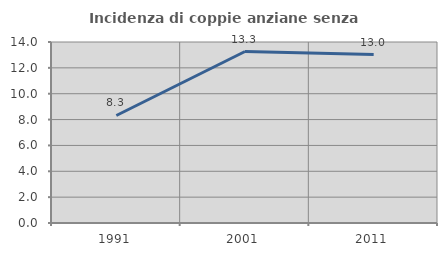
| Category | Incidenza di coppie anziane senza figli  |
|---|---|
| 1991.0 | 8.315 |
| 2001.0 | 13.263 |
| 2011.0 | 13.026 |